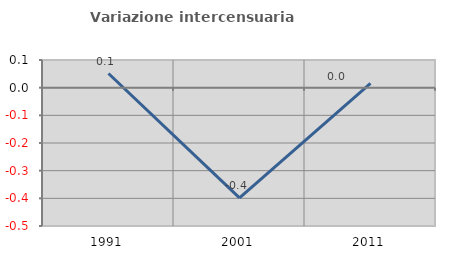
| Category | Variazione intercensuaria annua |
|---|---|
| 1991.0 | 0.051 |
| 2001.0 | -0.398 |
| 2011.0 | 0.016 |